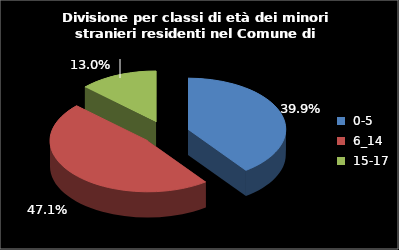
| Category | Series 0 |
|---|---|
| 0-5 | 83 |
| 6_14 | 98 |
| 15-17 | 27 |